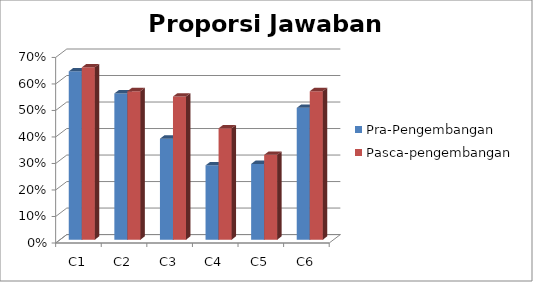
| Category | Pra-Pengembangan | Pasca-pengembangan |
|---|---|---|
| C1 | 0.635 | 0.65 |
| C2 | 0.552 | 0.56 |
| C3 | 0.381 | 0.54 |
| C4 | 0.28 | 0.42 |
| C5 | 0.286 | 0.32 |
| C6 | 0.497 | 0.56 |